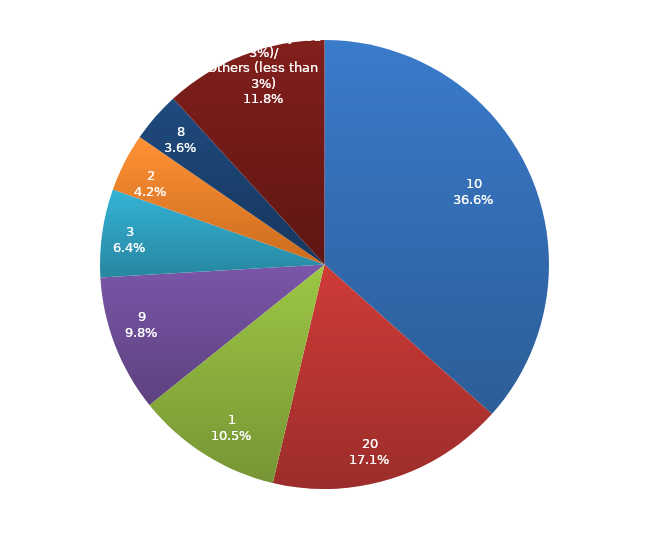
| Category | Series 0 |
|---|---|
| 10 | 33448837.13 |
| 20 | 15615585.1 |
| 1 | 9628973.5 |
| 9 | 8983806.09 |
| 3 | 5796635.18 |
| 2 | 3827479.46 |
| 8 | 3315205.66 |
|  Ostalo (manje od 3%)/
Others (less than 3%) | 10749920.47 |